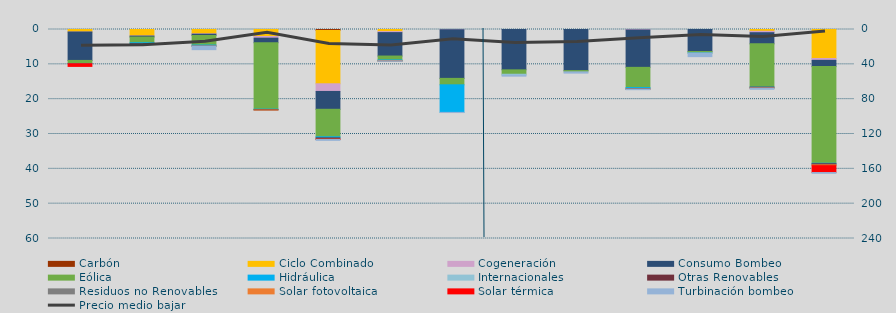
| Category | Carbón | Ciclo Combinado | Cogeneración | Consumo Bombeo | Eólica | Hidráulica | Internacionales | Otras Renovables | Residuos no Renovables | Solar fotovoltaica | Solar térmica | Turbinación bombeo |
|---|---|---|---|---|---|---|---|---|---|---|---|---|
| 0 | 0 | 720.2 | 1.2 | 8158 | 874.3 | 55.9 | 0 | 0 | 0 | 0 | 782.4 | 0 |
| 1 | 0 | 1851.6 | 42.3 | 273.4 | 1634.9 | 310 | 0 | 3.7 | 0 | 0 | 0 | 0 |
| 2 | 0 | 1244.2 | 103.6 | 370.8 | 2746.7 | 304.8 | 0 | 15.4 | 0 | 0.1 | 0 | 1000.2 |
| 3 | 0 | 2003.8 | 480.6 | 1308.7 | 19069.4 | 129.7 | 0 | 113.5 | 0 | 2 | 0 | 0 |
| 4 | 274.3 | 15310.9 | 2199.5 | 5123.2 | 7894.3 | 324.4 | 0 | 365.6 | 0 | 33.3 | 39.3 | 259.1 |
| 5 | 0 | 600 | 290.9 | 6727.7 | 1121.1 | 272.6 | 0 | 7.6 | 12.5 | 0.4 | 0 | 84 |
| 6 | 0 | 0 | 66 | 13968.1 | 1844.7 | 7917.4 | 0 | 0 | 0 | 0 | 0 | 46.9 |
| 7 | 0 | 0 | 13.8 | 11574.5 | 1255.7 | 0 | 313 | 0 | 0 | 0 | 0 | 240.1 |
| 8 | 0 | 0 | 0 | 11798.2 | 360.9 | 0 | 0 | 0 | 0 | 0 | 0 | 358.6 |
| 9 | 0 | 0 | 132.9 | 10732.4 | 5808.3 | 350.7 | 0 | 98.7 | 0 | 2.1 | 0 | 152.1 |
| 10 | 0 | 0 | 0 | 6311.1 | 429.6 | 2 | 0 | 0 | 0 | 0 | 0 | 1049.5 |
| 11 | 0 | 520 | 398.7 | 3208 | 12396.3 | 41.7 | 0 | 256.7 | 0 | 0.8 | 0 | 340.4 |
| 12 | 0 | 8320.6 | 532.5 | 1797.8 | 27746.3 | 146.7 | 0 | 300.2 | 0 | 250.5 | 1972.6 | 219.1 |